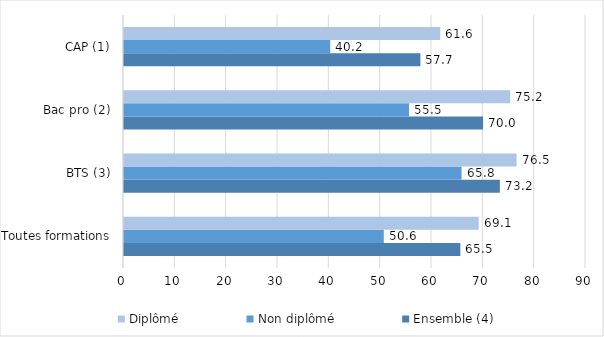
| Category | Ensemble (4) | Non diplômé | Diplômé |
|---|---|---|---|
| Toutes formations | 65.521 | 50.613 | 69.096 |
| BTS (3) | 73.214 | 65.753 | 76.476 |
| Bac pro (2) | 69.954 | 55.517 | 75.231 |
| CAP (1) | 57.737 | 40.179 | 61.61 |